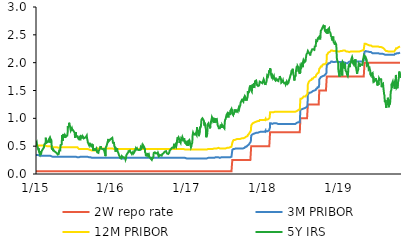
| Category | 2W repo rate | 3M PRIBOR | 12M PRIBOR | 5Y IRS |
|---|---|---|---|---|
| 2015-01-02 | 0.05 | 0.34 | 0.51 | 0.55 |
| 2015-01-05 | 0.05 | 0.34 | 0.51 | 0.57 |
| 2015-01-06 | 0.05 | 0.34 | 0.51 | 0.54 |
| 2015-01-07 | 0.05 | 0.34 | 0.51 | 0.51 |
| 2015-01-08 | 0.05 | 0.34 | 0.51 | 0.52 |
| 2015-01-09 | 0.05 | 0.34 | 0.51 | 0.49 |
| 2015-01-12 | 0.05 | 0.34 | 0.51 | 0.48 |
| 2015-01-13 | 0.05 | 0.33 | 0.51 | 0.44 |
| 2015-01-14 | 0.05 | 0.33 | 0.51 | 0.46 |
| 2015-01-15 | 0.05 | 0.33 | 0.51 | 0.45 |
| 2015-01-16 | 0.05 | 0.33 | 0.51 | 0.4 |
| 2015-01-19 | 0.05 | 0.33 | 0.51 | 0.4 |
| 2015-01-20 | 0.05 | 0.33 | 0.51 | 0.36 |
| 2015-01-21 | 0.05 | 0.33 | 0.51 | 0.38 |
| 2015-01-22 | 0.05 | 0.33 | 0.51 | 0.41 |
| 2015-01-23 | 0.05 | 0.33 | 0.51 | 0.35 |
| 2015-01-26 | 0.05 | 0.33 | 0.51 | 0.36 |
| 2015-01-27 | 0.05 | 0.33 | 0.51 | 0.38 |
| 2015-01-28 | 0.05 | 0.33 | 0.51 | 0.4 |
| 2015-01-29 | 0.05 | 0.33 | 0.51 | 0.41 |
| 2015-01-30 | 0.05 | 0.33 | 0.51 | 0.42 |
| 2015-02-02 | 0.05 | 0.33 | 0.51 | 0.41 |
| 2015-02-03 | 0.05 | 0.33 | 0.51 | 0.41 |
| 2015-02-04 | 0.05 | 0.33 | 0.51 | 0.45 |
| 2015-02-05 | 0.05 | 0.33 | 0.51 | 0.46 |
| 2015-02-06 | 0.05 | 0.33 | 0.51 | 0.46 |
| 2015-02-09 | 0.05 | 0.33 | 0.51 | 0.48 |
| 2015-02-10 | 0.05 | 0.33 | 0.51 | 0.49 |
| 2015-02-11 | 0.05 | 0.33 | 0.51 | 0.53 |
| 2015-02-12 | 0.05 | 0.33 | 0.51 | 0.54 |
| 2015-02-13 | 0.05 | 0.33 | 0.51 | 0.53 |
| 2015-02-16 | 0.05 | 0.33 | 0.51 | 0.55 |
| 2015-02-17 | 0.05 | 0.33 | 0.51 | 0.58 |
| 2015-02-18 | 0.05 | 0.33 | 0.51 | 0.65 |
| 2015-02-19 | 0.05 | 0.33 | 0.51 | 0.55 |
| 2015-02-20 | 0.05 | 0.33 | 0.5 | 0.6 |
| 2015-02-23 | 0.05 | 0.33 | 0.5 | 0.61 |
| 2015-02-24 | 0.05 | 0.33 | 0.5 | 0.61 |
| 2015-02-25 | 0.05 | 0.33 | 0.5 | 0.57 |
| 2015-02-26 | 0.05 | 0.33 | 0.5 | 0.57 |
| 2015-02-27 | 0.05 | 0.33 | 0.5 | 0.57 |
| 2015-03-02 | 0.05 | 0.33 | 0.5 | 0.58 |
| 2015-03-03 | 0.05 | 0.33 | 0.5 | 0.57 |
| 2015-03-04 | 0.05 | 0.33 | 0.5 | 0.62 |
| 2015-03-05 | 0.05 | 0.33 | 0.5 | 0.62 |
| 2015-03-06 | 0.05 | 0.33 | 0.5 | 0.62 |
| 2015-03-09 | 0.05 | 0.33 | 0.5 | 0.65 |
| 2015-03-10 | 0.05 | 0.33 | 0.5 | 0.62 |
| 2015-03-11 | 0.05 | 0.33 | 0.5 | 0.62 |
| 2015-03-12 | 0.05 | 0.33 | 0.5 | 0.56 |
| 2015-03-13 | 0.05 | 0.33 | 0.5 | 0.63 |
| 2015-03-16 | 0.05 | 0.32 | 0.49 | 0.61 |
| 2015-03-17 | 0.05 | 0.32 | 0.49 | 0.59 |
| 2015-03-18 | 0.05 | 0.31 | 0.49 | 0.5 |
| 2015-03-19 | 0.05 | 0.31 | 0.48 | 0.45 |
| 2015-03-20 | 0.05 | 0.31 | 0.48 | 0.44 |
| 2015-03-23 | 0.05 | 0.31 | 0.48 | 0.46 |
| 2015-03-24 | 0.05 | 0.31 | 0.48 | 0.44 |
| 2015-03-25 | 0.05 | 0.31 | 0.48 | 0.43 |
| 2015-03-26 | 0.05 | 0.31 | 0.48 | 0.41 |
| 2015-03-27 | 0.05 | 0.31 | 0.48 | 0.43 |
| 2015-03-30 | 0.05 | 0.31 | 0.48 | 0.41 |
| 2015-03-31 | 0.05 | 0.31 | 0.48 | 0.41 |
| 2015-04-01 | 0.05 | 0.31 | 0.48 | 0.41 |
| 2015-04-02 | 0.05 | 0.31 | 0.48 | 0.4 |
| 2015-04-03 | 0.05 | 0.31 | 0.48 | 0.4 |
| 2015-04-07 | 0.05 | 0.31 | 0.48 | 0.39 |
| 2015-04-08 | 0.05 | 0.31 | 0.48 | 0.39 |
| 2015-04-09 | 0.05 | 0.31 | 0.48 | 0.38 |
| 2015-04-10 | 0.05 | 0.31 | 0.48 | 0.38 |
| 2015-04-13 | 0.05 | 0.31 | 0.48 | 0.37 |
| 2015-04-14 | 0.05 | 0.31 | 0.47 | 0.37 |
| 2015-04-15 | 0.05 | 0.31 | 0.48 | 0.37 |
| 2015-04-16 | 0.05 | 0.31 | 0.47 | 0.35 |
| 2015-04-17 | 0.05 | 0.31 | 0.47 | 0.36 |
| 2015-04-20 | 0.05 | 0.31 | 0.47 | 0.35 |
| 2015-04-21 | 0.05 | 0.31 | 0.47 | 0.36 |
| 2015-04-22 | 0.05 | 0.31 | 0.47 | 0.38 |
| 2015-04-23 | 0.05 | 0.31 | 0.48 | 0.42 |
| 2015-04-24 | 0.05 | 0.31 | 0.47 | 0.42 |
| 2015-04-27 | 0.05 | 0.31 | 0.48 | 0.41 |
| 2015-04-28 | 0.05 | 0.31 | 0.48 | 0.42 |
| 2015-04-29 | 0.05 | 0.31 | 0.48 | 0.47 |
| 2015-04-30 | 0.05 | 0.31 | 0.48 | 0.52 |
| 2015-05-04 | 0.05 | 0.31 | 0.48 | 0.53 |
| 2015-05-05 | 0.05 | 0.31 | 0.48 | 0.53 |
| 2015-05-06 | 0.05 | 0.31 | 0.48 | 0.59 |
| 2015-05-07 | 0.05 | 0.31 | 0.48 | 0.7 |
| 2015-05-11 | 0.05 | 0.31 | 0.48 | 0.6 |
| 2015-05-12 | 0.05 | 0.31 | 0.48 | 0.69 |
| 2015-05-13 | 0.05 | 0.31 | 0.48 | 0.66 |
| 2015-05-14 | 0.05 | 0.31 | 0.48 | 0.72 |
| 2015-05-15 | 0.05 | 0.31 | 0.48 | 0.7 |
| 2015-05-18 | 0.05 | 0.31 | 0.48 | 0.7 |
| 2015-05-19 | 0.05 | 0.31 | 0.48 | 0.65 |
| 2015-05-20 | 0.05 | 0.31 | 0.48 | 0.68 |
| 2015-05-21 | 0.05 | 0.31 | 0.48 | 0.7 |
| 2015-05-22 | 0.05 | 0.31 | 0.48 | 0.7 |
| 2015-05-25 | 0.05 | 0.31 | 0.48 | 0.7 |
| 2015-05-26 | 0.05 | 0.31 | 0.48 | 0.67 |
| 2015-05-27 | 0.05 | 0.31 | 0.48 | 0.67 |
| 2015-05-28 | 0.05 | 0.31 | 0.48 | 0.66 |
| 2015-05-29 | 0.05 | 0.31 | 0.48 | 0.68 |
| 2015-06-01 | 0.05 | 0.31 | 0.48 | 0.69 |
| 2015-06-02 | 0.05 | 0.31 | 0.48 | 0.72 |
| 2015-06-03 | 0.05 | 0.31 | 0.48 | 0.75 |
| 2015-06-04 | 0.05 | 0.31 | 0.48 | 0.86 |
| 2015-06-05 | 0.05 | 0.31 | 0.48 | 0.84 |
| 2015-06-08 | 0.05 | 0.31 | 0.48 | 0.84 |
| 2015-06-09 | 0.05 | 0.31 | 0.48 | 0.86 |
| 2015-06-10 | 0.05 | 0.31 | 0.48 | 0.92 |
| 2015-06-11 | 0.05 | 0.31 | 0.48 | 0.92 |
| 2015-06-12 | 0.05 | 0.31 | 0.48 | 0.89 |
| 2015-06-15 | 0.05 | 0.31 | 0.48 | 0.85 |
| 2015-06-16 | 0.05 | 0.31 | 0.48 | 0.82 |
| 2015-06-17 | 0.05 | 0.31 | 0.48 | 0.82 |
| 2015-06-18 | 0.05 | 0.31 | 0.48 | 0.78 |
| 2015-06-19 | 0.05 | 0.31 | 0.48 | 0.77 |
| 2015-06-22 | 0.05 | 0.31 | 0.48 | 0.79 |
| 2015-06-23 | 0.05 | 0.31 | 0.48 | 0.82 |
| 2015-06-24 | 0.05 | 0.31 | 0.48 | 0.8 |
| 2015-06-25 | 0.05 | 0.31 | 0.48 | 0.78 |
| 2015-06-26 | 0.05 | 0.31 | 0.48 | 0.8 |
| 2015-06-29 | 0.05 | 0.31 | 0.48 | 0.8 |
| 2015-06-30 | 0.05 | 0.31 | 0.48 | 0.78 |
| 2015-07-01 | 0.05 | 0.31 | 0.48 | 0.79 |
| 2015-07-02 | 0.05 | 0.31 | 0.48 | 0.79 |
| 2015-07-03 | 0.05 | 0.31 | 0.48 | 0.78 |
| 2015-07-07 | 0.05 | 0.31 | 0.48 | 0.74 |
| 2015-07-08 | 0.05 | 0.31 | 0.47 | 0.68 |
| 2015-07-09 | 0.05 | 0.31 | 0.47 | 0.65 |
| 2015-07-10 | 0.05 | 0.31 | 0.47 | 0.7 |
| 2015-07-13 | 0.05 | 0.31 | 0.48 | 0.75 |
| 2015-07-14 | 0.05 | 0.31 | 0.48 | 0.68 |
| 2015-07-15 | 0.05 | 0.3 | 0.48 | 0.69 |
| 2015-07-16 | 0.05 | 0.3 | 0.48 | 0.67 |
| 2015-07-17 | 0.05 | 0.3 | 0.48 | 0.69 |
| 2015-07-20 | 0.05 | 0.3 | 0.48 | 0.68 |
| 2015-07-21 | 0.05 | 0.3 | 0.48 | 0.66 |
| 2015-07-22 | 0.05 | 0.31 | 0.48 | 0.67 |
| 2015-07-23 | 0.05 | 0.31 | 0.48 | 0.67 |
| 2015-07-24 | 0.05 | 0.3 | 0.48 | 0.64 |
| 2015-07-27 | 0.05 | 0.3 | 0.45 | 0.63 |
| 2015-07-28 | 0.05 | 0.3 | 0.45 | 0.63 |
| 2015-07-29 | 0.05 | 0.3 | 0.45 | 0.66 |
| 2015-07-30 | 0.05 | 0.3 | 0.45 | 0.62 |
| 2015-07-31 | 0.05 | 0.31 | 0.45 | 0.62 |
| 2015-08-03 | 0.05 | 0.31 | 0.45 | 0.62 |
| 2015-08-04 | 0.05 | 0.31 | 0.45 | 0.62 |
| 2015-08-05 | 0.05 | 0.31 | 0.45 | 0.64 |
| 2015-08-06 | 0.05 | 0.31 | 0.45 | 0.68 |
| 2015-08-07 | 0.05 | 0.31 | 0.45 | 0.68 |
| 2015-08-10 | 0.05 | 0.31 | 0.45 | 0.68 |
| 2015-08-11 | 0.05 | 0.31 | 0.45 | 0.67 |
| 2015-08-12 | 0.05 | 0.31 | 0.45 | 0.64 |
| 2015-08-13 | 0.05 | 0.31 | 0.45 | 0.65 |
| 2015-08-14 | 0.05 | 0.31 | 0.45 | 0.68 |
| 2015-08-17 | 0.05 | 0.31 | 0.45 | 0.67 |
| 2015-08-18 | 0.05 | 0.31 | 0.45 | 0.66 |
| 2015-08-19 | 0.05 | 0.31 | 0.45 | 0.65 |
| 2015-08-20 | 0.05 | 0.31 | 0.45 | 0.64 |
| 2015-08-21 | 0.05 | 0.31 | 0.45 | 0.64 |
| 2015-08-24 | 0.05 | 0.31 | 0.45 | 0.63 |
| 2015-08-25 | 0.05 | 0.31 | 0.45 | 0.65 |
| 2015-08-26 | 0.05 | 0.31 | 0.45 | 0.65 |
| 2015-08-27 | 0.05 | 0.31 | 0.45 | 0.66 |
| 2015-08-28 | 0.05 | 0.31 | 0.45 | 0.66 |
| 2015-08-31 | 0.05 | 0.31 | 0.45 | 0.67 |
| 2015-09-01 | 0.05 | 0.31 | 0.45 | 0.68 |
| 2015-09-02 | 0.05 | 0.31 | 0.45 | 0.68 |
| 2015-09-03 | 0.05 | 0.31 | 0.45 | 0.69 |
| 2015-09-04 | 0.05 | 0.31 | 0.45 | 0.65 |
| 2015-09-07 | 0.05 | 0.31 | 0.45 | 0.6 |
| 2015-09-08 | 0.05 | 0.3 | 0.44 | 0.57 |
| 2015-09-09 | 0.05 | 0.3 | 0.44 | 0.57 |
| 2015-09-10 | 0.05 | 0.3 | 0.44 | 0.57 |
| 2015-09-11 | 0.05 | 0.3 | 0.44 | 0.56 |
| 2015-09-14 | 0.05 | 0.3 | 0.44 | 0.52 |
| 2015-09-15 | 0.05 | 0.3 | 0.44 | 0.54 |
| 2015-09-16 | 0.05 | 0.31 | 0.44 | 0.56 |
| 2015-09-17 | 0.05 | 0.31 | 0.44 | 0.57 |
| 2015-09-18 | 0.05 | 0.31 | 0.44 | 0.53 |
| 2015-09-21 | 0.05 | 0.3 | 0.43 | 0.53 |
| 2015-09-22 | 0.05 | 0.3 | 0.43 | 0.51 |
| 2015-09-23 | 0.05 | 0.3 | 0.43 | 0.53 |
| 2015-09-24 | 0.05 | 0.3 | 0.43 | 0.53 |
| 2015-09-25 | 0.05 | 0.29 | 0.42 | 0.53 |
| 2015-09-29 | 0.05 | 0.29 | 0.42 | 0.53 |
| 2015-09-30 | 0.05 | 0.29 | 0.42 | 0.48 |
| 2015-10-01 | 0.05 | 0.29 | 0.42 | 0.53 |
| 2015-10-02 | 0.05 | 0.29 | 0.42 | 0.53 |
| 2015-10-05 | 0.05 | 0.29 | 0.42 | 0.42 |
| 2015-10-06 | 0.05 | 0.29 | 0.42 | 0.46 |
| 2015-10-07 | 0.05 | 0.29 | 0.42 | 0.46 |
| 2015-10-08 | 0.05 | 0.29 | 0.42 | 0.44 |
| 2015-10-09 | 0.05 | 0.29 | 0.42 | 0.44 |
| 2015-10-12 | 0.05 | 0.29 | 0.42 | 0.45 |
| 2015-10-13 | 0.05 | 0.29 | 0.42 | 0.43 |
| 2015-10-14 | 0.05 | 0.29 | 0.42 | 0.43 |
| 2015-10-15 | 0.05 | 0.29 | 0.42 | 0.43 |
| 2015-10-16 | 0.05 | 0.29 | 0.42 | 0.44 |
| 2015-10-19 | 0.05 | 0.29 | 0.42 | 0.46 |
| 2015-10-20 | 0.05 | 0.29 | 0.42 | 0.44 |
| 2015-10-21 | 0.05 | 0.29 | 0.42 | 0.45 |
| 2015-10-22 | 0.05 | 0.29 | 0.42 | 0.42 |
| 2015-10-23 | 0.05 | 0.29 | 0.42 | 0.39 |
| 2015-10-26 | 0.05 | 0.29 | 0.46 | 0.4 |
| 2015-10-27 | 0.05 | 0.29 | 0.45 | 0.38 |
| 2015-10-29 | 0.05 | 0.29 | 0.45 | 0.38 |
| 2015-10-30 | 0.05 | 0.29 | 0.45 | 0.41 |
| 2015-11-02 | 0.05 | 0.29 | 0.45 | 0.43 |
| 2015-11-03 | 0.05 | 0.29 | 0.46 | 0.44 |
| 2015-11-04 | 0.05 | 0.29 | 0.46 | 0.44 |
| 2015-11-05 | 0.05 | 0.29 | 0.46 | 0.44 |
| 2015-11-06 | 0.05 | 0.29 | 0.45 | 0.44 |
| 2015-11-09 | 0.05 | 0.29 | 0.46 | 0.5 |
| 2015-11-10 | 0.05 | 0.29 | 0.46 | 0.46 |
| 2015-11-11 | 0.05 | 0.29 | 0.46 | 0.46 |
| 2015-11-12 | 0.05 | 0.29 | 0.46 | 0.45 |
| 2015-11-13 | 0.05 | 0.29 | 0.46 | 0.46 |
| 2015-11-16 | 0.05 | 0.29 | 0.46 | 0.45 |
| 2015-11-18 | 0.05 | 0.29 | 0.46 | 0.45 |
| 2015-11-19 | 0.05 | 0.29 | 0.46 | 0.44 |
| 2015-11-20 | 0.05 | 0.29 | 0.46 | 0.44 |
| 2015-11-23 | 0.05 | 0.29 | 0.46 | 0.44 |
| 2015-11-24 | 0.05 | 0.29 | 0.46 | 0.44 |
| 2015-11-25 | 0.05 | 0.29 | 0.46 | 0.46 |
| 2015-11-26 | 0.05 | 0.29 | 0.46 | 0.42 |
| 2015-11-27 | 0.05 | 0.29 | 0.45 | 0.42 |
| 2015-11-30 | 0.05 | 0.29 | 0.45 | 0.36 |
| 2015-12-01 | 0.05 | 0.28 | 0.45 | 0.37 |
| 2015-12-02 | 0.05 | 0.28 | 0.45 | 0.32 |
| 2015-12-03 | 0.05 | 0.28 | 0.45 | 0.34 |
| 2015-12-04 | 0.05 | 0.29 | 0.46 | 0.48 |
| 2015-12-07 | 0.05 | 0.29 | 0.46 | 0.5 |
| 2015-12-08 | 0.05 | 0.29 | 0.46 | 0.49 |
| 2015-12-09 | 0.05 | 0.29 | 0.46 | 0.51 |
| 2015-12-10 | 0.05 | 0.29 | 0.46 | 0.54 |
| 2015-12-11 | 0.05 | 0.29 | 0.46 | 0.53 |
| 2015-12-14 | 0.05 | 0.29 | 0.46 | 0.55 |
| 2015-12-15 | 0.05 | 0.29 | 0.46 | 0.61 |
| 2015-12-16 | 0.05 | 0.29 | 0.46 | 0.63 |
| 2015-12-17 | 0.05 | 0.29 | 0.46 | 0.62 |
| 2015-12-18 | 0.05 | 0.29 | 0.46 | 0.59 |
| 2015-12-21 | 0.05 | 0.29 | 0.46 | 0.59 |
| 2015-12-22 | 0.05 | 0.29 | 0.46 | 0.59 |
| 2015-12-23 | 0.05 | 0.29 | 0.46 | 0.61 |
| 2015-12-28 | 0.05 | 0.29 | 0.46 | 0.63 |
| 2015-12-29 | 0.05 | 0.29 | 0.46 | 0.63 |
| 2015-12-30 | 0.05 | 0.29 | 0.46 | 0.64 |
| 2015-12-31 | 0.05 | 0.29 | 0.46 | 0.64 |
| 2016-01-04 | 0.05 | 0.29 | 0.46 | 0.65 |
| 2016-01-05 | 0.05 | 0.29 | 0.46 | 0.63 |
| 2016-01-06 | 0.05 | 0.29 | 0.46 | 0.62 |
| 2016-01-07 | 0.05 | 0.29 | 0.46 | 0.56 |
| 2016-01-08 | 0.05 | 0.29 | 0.46 | 0.57 |
| 2016-01-11 | 0.05 | 0.29 | 0.45 | 0.56 |
| 2016-01-12 | 0.05 | 0.29 | 0.45 | 0.56 |
| 2016-01-13 | 0.05 | 0.29 | 0.45 | 0.56 |
| 2016-01-14 | 0.05 | 0.29 | 0.45 | 0.5 |
| 2016-01-15 | 0.05 | 0.29 | 0.45 | 0.49 |
| 2016-01-18 | 0.05 | 0.29 | 0.45 | 0.46 |
| 2016-01-19 | 0.05 | 0.29 | 0.45 | 0.46 |
| 2016-01-20 | 0.05 | 0.29 | 0.45 | 0.4 |
| 2016-01-21 | 0.05 | 0.29 | 0.45 | 0.43 |
| 2016-01-22 | 0.05 | 0.29 | 0.45 | 0.46 |
| 2016-01-25 | 0.05 | 0.29 | 0.45 | 0.45 |
| 2016-01-26 | 0.05 | 0.29 | 0.45 | 0.44 |
| 2016-01-27 | 0.05 | 0.29 | 0.45 | 0.46 |
| 2016-01-28 | 0.05 | 0.29 | 0.45 | 0.44 |
| 2016-01-29 | 0.05 | 0.29 | 0.45 | 0.41 |
| 2016-02-01 | 0.05 | 0.29 | 0.45 | 0.4 |
| 2016-02-02 | 0.05 | 0.29 | 0.45 | 0.38 |
| 2016-02-03 | 0.05 | 0.29 | 0.45 | 0.37 |
| 2016-02-04 | 0.05 | 0.29 | 0.45 | 0.37 |
| 2016-02-05 | 0.05 | 0.29 | 0.45 | 0.34 |
| 2016-02-08 | 0.05 | 0.29 | 0.45 | 0.32 |
| 2016-02-09 | 0.05 | 0.28 | 0.45 | 0.31 |
| 2016-02-10 | 0.05 | 0.28 | 0.45 | 0.31 |
| 2016-02-11 | 0.05 | 0.28 | 0.45 | 0.29 |
| 2016-02-12 | 0.05 | 0.28 | 0.45 | 0.28 |
| 2016-02-15 | 0.05 | 0.28 | 0.45 | 0.28 |
| 2016-02-16 | 0.05 | 0.28 | 0.45 | 0.28 |
| 2016-02-17 | 0.05 | 0.28 | 0.45 | 0.28 |
| 2016-02-18 | 0.05 | 0.28 | 0.45 | 0.3 |
| 2016-02-19 | 0.05 | 0.28 | 0.45 | 0.32 |
| 2016-02-22 | 0.05 | 0.28 | 0.45 | 0.32 |
| 2016-02-23 | 0.05 | 0.28 | 0.45 | 0.32 |
| 2016-02-24 | 0.05 | 0.28 | 0.45 | 0.3 |
| 2016-02-25 | 0.05 | 0.28 | 0.45 | 0.3 |
| 2016-02-26 | 0.05 | 0.28 | 0.45 | 0.31 |
| 2016-02-29 | 0.05 | 0.28 | 0.45 | 0.3 |
| 2016-03-01 | 0.05 | 0.28 | 0.45 | 0.29 |
| 2016-03-02 | 0.05 | 0.28 | 0.45 | 0.31 |
| 2016-03-03 | 0.05 | 0.28 | 0.45 | 0.3 |
| 2016-03-04 | 0.05 | 0.28 | 0.45 | 0.29 |
| 2016-03-07 | 0.05 | 0.28 | 0.45 | 0.28 |
| 2016-03-08 | 0.05 | 0.28 | 0.45 | 0.26 |
| 2016-03-09 | 0.05 | 0.28 | 0.45 | 0.26 |
| 2016-03-10 | 0.05 | 0.28 | 0.45 | 0.28 |
| 2016-03-11 | 0.05 | 0.29 | 0.45 | 0.33 |
| 2016-03-14 | 0.05 | 0.29 | 0.45 | 0.34 |
| 2016-03-15 | 0.05 | 0.29 | 0.45 | 0.36 |
| 2016-03-16 | 0.05 | 0.29 | 0.45 | 0.37 |
| 2016-03-17 | 0.05 | 0.29 | 0.45 | 0.37 |
| 2016-03-18 | 0.05 | 0.29 | 0.45 | 0.37 |
| 2016-03-21 | 0.05 | 0.29 | 0.45 | 0.39 |
| 2016-03-22 | 0.05 | 0.29 | 0.45 | 0.41 |
| 2016-03-23 | 0.05 | 0.29 | 0.45 | 0.41 |
| 2016-03-24 | 0.05 | 0.29 | 0.45 | 0.4 |
| 2016-03-29 | 0.05 | 0.29 | 0.45 | 0.42 |
| 2016-03-30 | 0.05 | 0.29 | 0.45 | 0.4 |
| 2016-03-31 | 0.05 | 0.29 | 0.45 | 0.4 |
| 2016-04-01 | 0.05 | 0.29 | 0.45 | 0.4 |
| 2016-04-04 | 0.05 | 0.29 | 0.45 | 0.38 |
| 2016-04-05 | 0.05 | 0.29 | 0.45 | 0.37 |
| 2016-04-06 | 0.05 | 0.29 | 0.45 | 0.38 |
| 2016-04-07 | 0.05 | 0.29 | 0.45 | 0.36 |
| 2016-04-08 | 0.05 | 0.29 | 0.45 | 0.36 |
| 2016-04-11 | 0.05 | 0.29 | 0.45 | 0.35 |
| 2016-04-12 | 0.05 | 0.29 | 0.45 | 0.39 |
| 2016-04-13 | 0.05 | 0.29 | 0.45 | 0.37 |
| 2016-04-14 | 0.05 | 0.29 | 0.45 | 0.39 |
| 2016-04-15 | 0.05 | 0.29 | 0.45 | 0.37 |
| 2016-04-18 | 0.05 | 0.29 | 0.45 | 0.37 |
| 2016-04-19 | 0.05 | 0.29 | 0.45 | 0.39 |
| 2016-04-20 | 0.05 | 0.29 | 0.45 | 0.38 |
| 2016-04-21 | 0.05 | 0.29 | 0.45 | 0.41 |
| 2016-04-22 | 0.05 | 0.29 | 0.45 | 0.41 |
| 2016-04-25 | 0.05 | 0.29 | 0.45 | 0.42 |
| 2016-04-26 | 0.05 | 0.29 | 0.45 | 0.46 |
| 2016-04-27 | 0.05 | 0.29 | 0.45 | 0.46 |
| 2016-04-28 | 0.05 | 0.29 | 0.45 | 0.44 |
| 2016-04-29 | 0.05 | 0.29 | 0.45 | 0.45 |
| 2016-05-02 | 0.05 | 0.29 | 0.45 | 0.46 |
| 2016-05-03 | 0.05 | 0.29 | 0.45 | 0.46 |
| 2016-05-04 | 0.05 | 0.29 | 0.45 | 0.44 |
| 2016-05-05 | 0.05 | 0.29 | 0.45 | 0.45 |
| 2016-05-06 | 0.05 | 0.29 | 0.45 | 0.44 |
| 2016-05-09 | 0.05 | 0.29 | 0.45 | 0.43 |
| 2016-05-10 | 0.05 | 0.29 | 0.45 | 0.44 |
| 2016-05-11 | 0.05 | 0.29 | 0.45 | 0.43 |
| 2016-05-12 | 0.05 | 0.29 | 0.45 | 0.42 |
| 2016-05-13 | 0.05 | 0.29 | 0.45 | 0.43 |
| 2016-05-16 | 0.05 | 0.29 | 0.45 | 0.43 |
| 2016-05-17 | 0.05 | 0.29 | 0.45 | 0.44 |
| 2016-05-18 | 0.05 | 0.29 | 0.45 | 0.44 |
| 2016-05-19 | 0.05 | 0.29 | 0.45 | 0.46 |
| 2016-05-20 | 0.05 | 0.29 | 0.45 | 0.48 |
| 2016-05-23 | 0.05 | 0.29 | 0.45 | 0.46 |
| 2016-05-24 | 0.05 | 0.29 | 0.45 | 0.46 |
| 2016-05-25 | 0.05 | 0.29 | 0.45 | 0.48 |
| 2016-05-26 | 0.05 | 0.29 | 0.45 | 0.48 |
| 2016-05-27 | 0.05 | 0.29 | 0.45 | 0.51 |
| 2016-05-30 | 0.05 | 0.29 | 0.45 | 0.49 |
| 2016-05-31 | 0.05 | 0.29 | 0.45 | 0.52 |
| 2016-06-01 | 0.05 | 0.29 | 0.45 | 0.51 |
| 2016-06-02 | 0.05 | 0.29 | 0.45 | 0.51 |
| 2016-06-03 | 0.05 | 0.29 | 0.45 | 0.51 |
| 2016-06-06 | 0.05 | 0.29 | 0.45 | 0.48 |
| 2016-06-07 | 0.05 | 0.29 | 0.45 | 0.49 |
| 2016-06-08 | 0.05 | 0.29 | 0.45 | 0.47 |
| 2016-06-09 | 0.05 | 0.29 | 0.45 | 0.45 |
| 2016-06-10 | 0.05 | 0.29 | 0.45 | 0.39 |
| 2016-06-13 | 0.05 | 0.29 | 0.45 | 0.37 |
| 2016-06-14 | 0.05 | 0.29 | 0.45 | 0.32 |
| 2016-06-15 | 0.05 | 0.29 | 0.45 | 0.32 |
| 2016-06-16 | 0.05 | 0.29 | 0.45 | 0.32 |
| 2016-06-17 | 0.05 | 0.29 | 0.45 | 0.35 |
| 2016-06-20 | 0.05 | 0.29 | 0.45 | 0.35 |
| 2016-06-21 | 0.05 | 0.29 | 0.45 | 0.36 |
| 2016-06-22 | 0.05 | 0.29 | 0.45 | 0.36 |
| 2016-06-23 | 0.05 | 0.29 | 0.45 | 0.36 |
| 2016-06-24 | 0.05 | 0.29 | 0.45 | 0.33 |
| 2016-06-27 | 0.05 | 0.29 | 0.45 | 0.32 |
| 2016-06-28 | 0.05 | 0.29 | 0.45 | 0.35 |
| 2016-06-29 | 0.05 | 0.29 | 0.45 | 0.33 |
| 2016-06-30 | 0.05 | 0.29 | 0.45 | 0.31 |
| 2016-07-01 | 0.05 | 0.29 | 0.45 | 0.31 |
| 2016-07-04 | 0.05 | 0.29 | 0.45 | 0.29 |
| 2016-07-07 | 0.05 | 0.29 | 0.45 | 0.28 |
| 2016-07-08 | 0.05 | 0.29 | 0.45 | 0.28 |
| 2016-07-11 | 0.05 | 0.29 | 0.45 | 0.26 |
| 2016-07-12 | 0.05 | 0.29 | 0.45 | 0.3 |
| 2016-07-13 | 0.05 | 0.29 | 0.45 | 0.29 |
| 2016-07-14 | 0.05 | 0.29 | 0.45 | 0.27 |
| 2016-07-15 | 0.05 | 0.29 | 0.45 | 0.28 |
| 2016-07-18 | 0.05 | 0.29 | 0.45 | 0.29 |
| 2016-07-19 | 0.05 | 0.29 | 0.45 | 0.28 |
| 2016-07-20 | 0.05 | 0.29 | 0.45 | 0.32 |
| 2016-07-21 | 0.05 | 0.29 | 0.45 | 0.36 |
| 2016-07-22 | 0.05 | 0.29 | 0.45 | 0.38 |
| 2016-07-25 | 0.05 | 0.29 | 0.45 | 0.38 |
| 2016-07-26 | 0.05 | 0.29 | 0.45 | 0.38 |
| 2016-07-27 | 0.05 | 0.29 | 0.45 | 0.39 |
| 2016-07-28 | 0.05 | 0.29 | 0.45 | 0.38 |
| 2016-07-29 | 0.05 | 0.29 | 0.45 | 0.38 |
| 2016-08-01 | 0.05 | 0.29 | 0.45 | 0.37 |
| 2016-08-02 | 0.05 | 0.29 | 0.45 | 0.37 |
| 2016-08-03 | 0.05 | 0.29 | 0.45 | 0.37 |
| 2016-08-04 | 0.05 | 0.29 | 0.45 | 0.38 |
| 2016-08-05 | 0.05 | 0.29 | 0.45 | 0.38 |
| 2016-08-08 | 0.05 | 0.29 | 0.45 | 0.38 |
| 2016-08-09 | 0.05 | 0.29 | 0.45 | 0.37 |
| 2016-08-10 | 0.05 | 0.29 | 0.45 | 0.37 |
| 2016-08-11 | 0.05 | 0.29 | 0.45 | 0.35 |
| 2016-08-12 | 0.05 | 0.29 | 0.45 | 0.37 |
| 2016-08-15 | 0.05 | 0.29 | 0.45 | 0.34 |
| 2016-08-16 | 0.05 | 0.29 | 0.45 | 0.32 |
| 2016-08-17 | 0.05 | 0.29 | 0.45 | 0.33 |
| 2016-08-18 | 0.05 | 0.29 | 0.45 | 0.33 |
| 2016-08-19 | 0.05 | 0.29 | 0.45 | 0.33 |
| 2016-08-22 | 0.05 | 0.29 | 0.45 | 0.34 |
| 2016-08-23 | 0.05 | 0.29 | 0.45 | 0.33 |
| 2016-08-24 | 0.05 | 0.29 | 0.45 | 0.33 |
| 2016-08-25 | 0.05 | 0.29 | 0.45 | 0.33 |
| 2016-08-26 | 0.05 | 0.29 | 0.45 | 0.33 |
| 2016-08-29 | 0.05 | 0.29 | 0.45 | 0.33 |
| 2016-08-30 | 0.05 | 0.29 | 0.45 | 0.33 |
| 2016-08-31 | 0.05 | 0.29 | 0.45 | 0.34 |
| 2016-09-01 | 0.05 | 0.29 | 0.45 | 0.36 |
| 2016-09-02 | 0.05 | 0.29 | 0.45 | 0.36 |
| 2016-09-05 | 0.05 | 0.29 | 0.45 | 0.37 |
| 2016-09-06 | 0.05 | 0.29 | 0.45 | 0.37 |
| 2016-09-07 | 0.05 | 0.29 | 0.45 | 0.36 |
| 2016-09-08 | 0.05 | 0.29 | 0.45 | 0.36 |
| 2016-09-09 | 0.05 | 0.29 | 0.45 | 0.38 |
| 2016-09-12 | 0.05 | 0.29 | 0.45 | 0.4 |
| 2016-09-13 | 0.05 | 0.29 | 0.45 | 0.4 |
| 2016-09-14 | 0.05 | 0.29 | 0.45 | 0.4 |
| 2016-09-15 | 0.05 | 0.29 | 0.45 | 0.41 |
| 2016-09-16 | 0.05 | 0.29 | 0.45 | 0.41 |
| 2016-09-19 | 0.05 | 0.29 | 0.45 | 0.41 |
| 2016-09-20 | 0.05 | 0.29 | 0.45 | 0.41 |
| 2016-09-21 | 0.05 | 0.29 | 0.45 | 0.39 |
| 2016-09-22 | 0.05 | 0.29 | 0.45 | 0.38 |
| 2016-09-23 | 0.05 | 0.29 | 0.45 | 0.37 |
| 2016-09-26 | 0.05 | 0.29 | 0.45 | 0.36 |
| 2016-09-27 | 0.05 | 0.29 | 0.45 | 0.36 |
| 2016-09-29 | 0.05 | 0.29 | 0.45 | 0.36 |
| 2016-09-30 | 0.05 | 0.29 | 0.45 | 0.36 |
| 2016-10-03 | 0.05 | 0.29 | 0.45 | 0.37 |
| 2016-10-04 | 0.05 | 0.29 | 0.45 | 0.38 |
| 2016-10-05 | 0.05 | 0.29 | 0.45 | 0.39 |
| 2016-10-06 | 0.05 | 0.29 | 0.45 | 0.42 |
| 2016-10-07 | 0.05 | 0.29 | 0.45 | 0.42 |
| 2016-10-10 | 0.05 | 0.29 | 0.45 | 0.43 |
| 2016-10-11 | 0.05 | 0.29 | 0.45 | 0.44 |
| 2016-10-12 | 0.05 | 0.29 | 0.45 | 0.44 |
| 2016-10-13 | 0.05 | 0.29 | 0.45 | 0.45 |
| 2016-10-14 | 0.05 | 0.29 | 0.45 | 0.45 |
| 2016-10-17 | 0.05 | 0.29 | 0.45 | 0.47 |
| 2016-10-18 | 0.05 | 0.29 | 0.45 | 0.47 |
| 2016-10-19 | 0.05 | 0.29 | 0.45 | 0.47 |
| 2016-10-20 | 0.05 | 0.29 | 0.45 | 0.48 |
| 2016-10-21 | 0.05 | 0.29 | 0.45 | 0.48 |
| 2016-10-24 | 0.05 | 0.29 | 0.45 | 0.48 |
| 2016-10-25 | 0.05 | 0.29 | 0.45 | 0.46 |
| 2016-10-26 | 0.05 | 0.29 | 0.45 | 0.48 |
| 2016-10-27 | 0.05 | 0.29 | 0.45 | 0.53 |
| 2016-10-31 | 0.05 | 0.29 | 0.45 | 0.54 |
| 2016-11-01 | 0.05 | 0.29 | 0.45 | 0.53 |
| 2016-11-02 | 0.05 | 0.29 | 0.45 | 0.51 |
| 2016-11-03 | 0.05 | 0.29 | 0.45 | 0.52 |
| 2016-11-04 | 0.05 | 0.29 | 0.45 | 0.53 |
| 2016-11-07 | 0.05 | 0.29 | 0.45 | 0.5 |
| 2016-11-08 | 0.05 | 0.29 | 0.45 | 0.49 |
| 2016-11-09 | 0.05 | 0.29 | 0.45 | 0.51 |
| 2016-11-10 | 0.05 | 0.29 | 0.45 | 0.55 |
| 2016-11-11 | 0.05 | 0.29 | 0.45 | 0.61 |
| 2016-11-14 | 0.05 | 0.29 | 0.45 | 0.66 |
| 2016-11-15 | 0.05 | 0.29 | 0.45 | 0.64 |
| 2016-11-16 | 0.05 | 0.29 | 0.45 | 0.65 |
| 2016-11-18 | 0.05 | 0.29 | 0.45 | 0.66 |
| 2016-11-21 | 0.05 | 0.29 | 0.45 | 0.63 |
| 2016-11-22 | 0.05 | 0.29 | 0.45 | 0.6 |
| 2016-11-23 | 0.05 | 0.29 | 0.45 | 0.56 |
| 2016-11-24 | 0.05 | 0.29 | 0.45 | 0.59 |
| 2016-11-25 | 0.05 | 0.29 | 0.45 | 0.59 |
| 2016-11-28 | 0.05 | 0.29 | 0.45 | 0.56 |
| 2016-11-29 | 0.05 | 0.29 | 0.45 | 0.56 |
| 2016-11-30 | 0.05 | 0.29 | 0.45 | 0.57 |
| 2016-12-01 | 0.05 | 0.29 | 0.45 | 0.64 |
| 2016-12-02 | 0.05 | 0.29 | 0.45 | 0.63 |
| 2016-12-05 | 0.05 | 0.29 | 0.45 | 0.62 |
| 2016-12-06 | 0.05 | 0.29 | 0.45 | 0.64 |
| 2016-12-07 | 0.05 | 0.29 | 0.45 | 0.66 |
| 2016-12-08 | 0.05 | 0.29 | 0.45 | 0.66 |
| 2016-12-09 | 0.05 | 0.29 | 0.45 | 0.64 |
| 2016-12-12 | 0.05 | 0.29 | 0.45 | 0.65 |
| 2016-12-13 | 0.05 | 0.29 | 0.45 | 0.63 |
| 2016-12-14 | 0.05 | 0.29 | 0.45 | 0.6 |
| 2016-12-15 | 0.05 | 0.29 | 0.45 | 0.64 |
| 2016-12-16 | 0.05 | 0.29 | 0.45 | 0.62 |
| 2016-12-19 | 0.05 | 0.29 | 0.44 | 0.59 |
| 2016-12-20 | 0.05 | 0.29 | 0.44 | 0.57 |
| 2016-12-21 | 0.05 | 0.29 | 0.44 | 0.56 |
| 2016-12-22 | 0.05 | 0.28 | 0.44 | 0.57 |
| 2016-12-23 | 0.05 | 0.28 | 0.44 | 0.55 |
| 2016-12-27 | 0.05 | 0.28 | 0.44 | 0.57 |
| 2016-12-28 | 0.05 | 0.27 | 0.43 | 0.54 |
| 2016-12-29 | 0.05 | 0.28 | 0.44 | 0.52 |
| 2016-12-30 | 0.05 | 0.28 | 0.44 | 0.52 |
| 2017-01-02 | 0.05 | 0.28 | 0.44 | 0.52 |
| 2017-01-03 | 0.05 | 0.28 | 0.44 | 0.52 |
| 2017-01-04 | 0.05 | 0.28 | 0.44 | 0.57 |
| 2017-01-05 | 0.05 | 0.28 | 0.44 | 0.59 |
| 2017-01-06 | 0.05 | 0.28 | 0.44 | 0.58 |
| 2017-01-09 | 0.05 | 0.28 | 0.44 | 0.61 |
| 2017-01-10 | 0.05 | 0.28 | 0.44 | 0.6 |
| 2017-01-11 | 0.05 | 0.28 | 0.44 | 0.59 |
| 2017-01-12 | 0.05 | 0.28 | 0.44 | 0.56 |
| 2017-01-13 | 0.05 | 0.28 | 0.44 | 0.52 |
| 2017-01-16 | 0.05 | 0.28 | 0.44 | 0.5 |
| 2017-01-17 | 0.05 | 0.28 | 0.44 | 0.48 |
| 2017-01-18 | 0.05 | 0.28 | 0.44 | 0.48 |
| 2017-01-19 | 0.05 | 0.28 | 0.44 | 0.5 |
| 2017-01-20 | 0.05 | 0.28 | 0.44 | 0.53 |
| 2017-01-23 | 0.05 | 0.28 | 0.44 | 0.56 |
| 2017-01-24 | 0.05 | 0.28 | 0.44 | 0.62 |
| 2017-01-25 | 0.05 | 0.28 | 0.44 | 0.7 |
| 2017-01-26 | 0.05 | 0.28 | 0.44 | 0.7 |
| 2017-01-27 | 0.05 | 0.28 | 0.44 | 0.74 |
| 2017-01-30 | 0.05 | 0.28 | 0.44 | 0.71 |
| 2017-01-31 | 0.05 | 0.28 | 0.44 | 0.71 |
| 2017-02-01 | 0.05 | 0.28 | 0.44 | 0.7 |
| 2017-02-02 | 0.05 | 0.28 | 0.44 | 0.72 |
| 2017-02-03 | 0.05 | 0.28 | 0.44 | 0.71 |
| 2017-02-06 | 0.05 | 0.28 | 0.44 | 0.71 |
| 2017-02-07 | 0.05 | 0.28 | 0.44 | 0.74 |
| 2017-02-08 | 0.05 | 0.28 | 0.44 | 0.75 |
| 2017-02-09 | 0.05 | 0.28 | 0.44 | 0.7 |
| 2017-02-10 | 0.05 | 0.28 | 0.44 | 0.72 |
| 2017-02-13 | 0.05 | 0.28 | 0.44 | 0.7 |
| 2017-02-14 | 0.05 | 0.28 | 0.44 | 0.77 |
| 2017-02-15 | 0.05 | 0.28 | 0.44 | 0.84 |
| 2017-02-16 | 0.05 | 0.28 | 0.44 | 0.83 |
| 2017-02-17 | 0.05 | 0.28 | 0.44 | 0.76 |
| 2017-02-20 | 0.05 | 0.28 | 0.44 | 0.79 |
| 2017-02-21 | 0.05 | 0.28 | 0.44 | 0.8 |
| 2017-02-22 | 0.05 | 0.28 | 0.44 | 0.78 |
| 2017-02-23 | 0.05 | 0.28 | 0.44 | 0.7 |
| 2017-02-24 | 0.05 | 0.28 | 0.44 | 0.68 |
| 2017-02-27 | 0.05 | 0.28 | 0.44 | 0.68 |
| 2017-02-28 | 0.05 | 0.28 | 0.44 | 0.77 |
| 2017-03-01 | 0.05 | 0.28 | 0.44 | 0.77 |
| 2017-03-02 | 0.05 | 0.28 | 0.44 | 0.85 |
| 2017-03-03 | 0.05 | 0.28 | 0.44 | 0.83 |
| 2017-03-06 | 0.05 | 0.28 | 0.44 | 0.86 |
| 2017-03-07 | 0.05 | 0.28 | 0.44 | 0.87 |
| 2017-03-08 | 0.05 | 0.28 | 0.44 | 0.96 |
| 2017-03-09 | 0.05 | 0.28 | 0.44 | 0.98 |
| 2017-03-10 | 0.05 | 0.28 | 0.44 | 0.99 |
| 2017-03-13 | 0.05 | 0.28 | 0.44 | 1 |
| 2017-03-14 | 0.05 | 0.28 | 0.44 | 1 |
| 2017-03-15 | 0.05 | 0.28 | 0.44 | 0.99 |
| 2017-03-16 | 0.05 | 0.28 | 0.44 | 0.99 |
| 2017-03-17 | 0.05 | 0.28 | 0.44 | 0.99 |
| 2017-03-20 | 0.05 | 0.28 | 0.44 | 0.96 |
| 2017-03-21 | 0.05 | 0.28 | 0.44 | 0.97 |
| 2017-03-22 | 0.05 | 0.28 | 0.44 | 0.9 |
| 2017-03-23 | 0.05 | 0.28 | 0.44 | 0.87 |
| 2017-03-24 | 0.05 | 0.28 | 0.44 | 0.92 |
| 2017-03-27 | 0.05 | 0.28 | 0.44 | 0.86 |
| 2017-03-28 | 0.05 | 0.28 | 0.44 | 0.84 |
| 2017-03-29 | 0.05 | 0.28 | 0.44 | 0.84 |
| 2017-03-30 | 0.05 | 0.28 | 0.44 | 0.8 |
| 2017-03-31 | 0.05 | 0.28 | 0.44 | 0.66 |
| 2017-04-03 | 0.05 | 0.28 | 0.44 | 0.71 |
| 2017-04-04 | 0.05 | 0.28 | 0.44 | 0.68 |
| 2017-04-05 | 0.05 | 0.28 | 0.44 | 0.73 |
| 2017-04-06 | 0.05 | 0.28 | 0.44 | 0.76 |
| 2017-04-07 | 0.05 | 0.29 | 0.44 | 0.89 |
| 2017-04-10 | 0.05 | 0.29 | 0.45 | 0.89 |
| 2017-04-11 | 0.05 | 0.29 | 0.45 | 0.91 |
| 2017-04-12 | 0.05 | 0.29 | 0.45 | 0.89 |
| 2017-04-13 | 0.05 | 0.29 | 0.45 | 0.88 |
| 2017-04-18 | 0.05 | 0.29 | 0.45 | 0.85 |
| 2017-04-19 | 0.05 | 0.29 | 0.45 | 0.82 |
| 2017-04-20 | 0.05 | 0.29 | 0.45 | 0.87 |
| 2017-04-21 | 0.05 | 0.29 | 0.45 | 0.88 |
| 2017-04-24 | 0.05 | 0.29 | 0.45 | 0.95 |
| 2017-04-25 | 0.05 | 0.29 | 0.45 | 0.93 |
| 2017-04-26 | 0.05 | 0.29 | 0.45 | 0.94 |
| 2017-04-27 | 0.05 | 0.29 | 0.45 | 0.99 |
| 2017-04-28 | 0.05 | 0.29 | 0.45 | 1.02 |
| 2017-05-02 | 0.05 | 0.29 | 0.45 | 1.02 |
| 2017-05-03 | 0.05 | 0.29 | 0.45 | 0.98 |
| 2017-05-04 | 0.05 | 0.29 | 0.45 | 1.01 |
| 2017-05-05 | 0.05 | 0.29 | 0.45 | 0.95 |
| 2017-05-09 | 0.05 | 0.29 | 0.46 | 0.97 |
| 2017-05-10 | 0.05 | 0.29 | 0.46 | 0.92 |
| 2017-05-11 | 0.05 | 0.3 | 0.46 | 0.94 |
| 2017-05-12 | 0.05 | 0.3 | 0.46 | 0.96 |
| 2017-05-15 | 0.05 | 0.3 | 0.46 | 0.96 |
| 2017-05-16 | 0.05 | 0.3 | 0.46 | 1 |
| 2017-05-17 | 0.05 | 0.3 | 0.46 | 0.97 |
| 2017-05-18 | 0.05 | 0.3 | 0.46 | 0.95 |
| 2017-05-19 | 0.05 | 0.3 | 0.46 | 0.96 |
| 2017-05-22 | 0.05 | 0.3 | 0.46 | 0.97 |
| 2017-05-23 | 0.05 | 0.3 | 0.46 | 0.94 |
| 2017-05-24 | 0.05 | 0.3 | 0.47 | 0.92 |
| 2017-05-25 | 0.05 | 0.3 | 0.47 | 0.89 |
| 2017-05-26 | 0.05 | 0.3 | 0.47 | 0.87 |
| 2017-05-29 | 0.05 | 0.3 | 0.47 | 0.87 |
| 2017-05-30 | 0.05 | 0.3 | 0.46 | 0.84 |
| 2017-05-31 | 0.05 | 0.3 | 0.46 | 0.82 |
| 2017-06-01 | 0.05 | 0.3 | 0.46 | 0.81 |
| 2017-06-02 | 0.05 | 0.29 | 0.46 | 0.81 |
| 2017-06-05 | 0.05 | 0.29 | 0.46 | 0.82 |
| 2017-06-06 | 0.05 | 0.29 | 0.46 | 0.82 |
| 2017-06-07 | 0.05 | 0.29 | 0.46 | 0.81 |
| 2017-06-08 | 0.05 | 0.29 | 0.46 | 0.85 |
| 2017-06-09 | 0.05 | 0.3 | 0.46 | 0.89 |
| 2017-06-12 | 0.05 | 0.3 | 0.46 | 0.86 |
| 2017-06-13 | 0.05 | 0.3 | 0.46 | 0.87 |
| 2017-06-14 | 0.05 | 0.3 | 0.46 | 0.87 |
| 2017-06-15 | 0.05 | 0.3 | 0.46 | 0.83 |
| 2017-06-16 | 0.05 | 0.3 | 0.46 | 0.88 |
| 2017-06-19 | 0.05 | 0.3 | 0.46 | 0.86 |
| 2017-06-20 | 0.05 | 0.3 | 0.46 | 0.86 |
| 2017-06-21 | 0.05 | 0.3 | 0.46 | 0.86 |
| 2017-06-22 | 0.05 | 0.3 | 0.46 | 0.86 |
| 2017-06-23 | 0.05 | 0.3 | 0.46 | 0.84 |
| 2017-06-26 | 0.05 | 0.3 | 0.46 | 0.83 |
| 2017-06-27 | 0.05 | 0.3 | 0.46 | 0.82 |
| 2017-06-28 | 0.05 | 0.3 | 0.46 | 0.89 |
| 2017-06-29 | 0.05 | 0.29 | 0.46 | 0.94 |
| 2017-06-30 | 0.05 | 0.3 | 0.46 | 0.97 |
| 2017-07-03 | 0.05 | 0.3 | 0.46 | 0.99 |
| 2017-07-04 | 0.05 | 0.3 | 0.46 | 0.98 |
| 2017-07-07 | 0.05 | 0.3 | 0.47 | 1.06 |
| 2017-07-10 | 0.05 | 0.3 | 0.47 | 1.08 |
| 2017-07-11 | 0.05 | 0.3 | 0.47 | 1.05 |
| 2017-07-12 | 0.05 | 0.3 | 0.47 | 1.05 |
| 2017-07-13 | 0.05 | 0.3 | 0.47 | 1.03 |
| 2017-07-14 | 0.05 | 0.3 | 0.47 | 1.03 |
| 2017-07-17 | 0.05 | 0.3 | 0.47 | 1.03 |
| 2017-07-18 | 0.05 | 0.3 | 0.47 | 1.03 |
| 2017-07-19 | 0.05 | 0.3 | 0.47 | 1.09 |
| 2017-07-20 | 0.05 | 0.3 | 0.48 | 1.1 |
| 2017-07-21 | 0.05 | 0.3 | 0.48 | 1.08 |
| 2017-07-24 | 0.05 | 0.3 | 0.48 | 1.08 |
| 2017-07-25 | 0.05 | 0.3 | 0.48 | 1.13 |
| 2017-07-26 | 0.05 | 0.3 | 0.48 | 1.14 |
| 2017-07-27 | 0.05 | 0.3 | 0.48 | 1.14 |
| 2017-07-28 | 0.05 | 0.31 | 0.48 | 1.15 |
| 2017-07-31 | 0.05 | 0.31 | 0.49 | 1.17 |
| 2017-08-01 | 0.05 | 0.31 | 0.49 | 1.18 |
| 2017-08-02 | 0.05 | 0.31 | 0.49 | 1.14 |
| 2017-08-03 | 0.05 | 0.31 | 0.49 | 1.16 |
| 2017-08-04 | 0.25 | 0.43 | 0.56 | 1.08 |
| 2017-08-07 | 0.25 | 0.44 | 0.59 | 1.07 |
| 2017-08-08 | 0.25 | 0.44 | 0.6 | 1.06 |
| 2017-08-09 | 0.25 | 0.45 | 0.6 | 1.09 |
| 2017-08-10 | 0.25 | 0.45 | 0.61 | 1.07 |
| 2017-08-11 | 0.25 | 0.45 | 0.61 | 1.09 |
| 2017-08-14 | 0.25 | 0.45 | 0.61 | 1.11 |
| 2017-08-15 | 0.25 | 0.45 | 0.61 | 1.11 |
| 2017-08-16 | 0.25 | 0.45 | 0.62 | 1.16 |
| 2017-08-17 | 0.25 | 0.46 | 0.62 | 1.14 |
| 2017-08-18 | 0.25 | 0.46 | 0.62 | 1.14 |
| 2017-08-21 | 0.25 | 0.46 | 0.62 | 1.14 |
| 2017-08-22 | 0.25 | 0.46 | 0.63 | 1.12 |
| 2017-08-23 | 0.25 | 0.46 | 0.63 | 1.13 |
| 2017-08-24 | 0.25 | 0.46 | 0.63 | 1.13 |
| 2017-08-25 | 0.25 | 0.46 | 0.63 | 1.14 |
| 2017-08-28 | 0.25 | 0.46 | 0.63 | 1.14 |
| 2017-08-29 | 0.25 | 0.46 | 0.63 | 1.14 |
| 2017-08-30 | 0.25 | 0.46 | 0.63 | 1.12 |
| 2017-08-31 | 0.25 | 0.46 | 0.63 | 1.14 |
| 2017-09-01 | 0.25 | 0.46 | 0.63 | 1.15 |
| 2017-09-04 | 0.25 | 0.46 | 0.63 | 1.19 |
| 2017-09-05 | 0.25 | 0.46 | 0.63 | 1.19 |
| 2017-09-06 | 0.25 | 0.46 | 0.63 | 1.17 |
| 2017-09-07 | 0.25 | 0.46 | 0.63 | 1.19 |
| 2017-09-08 | 0.25 | 0.46 | 0.63 | 1.2 |
| 2017-09-11 | 0.25 | 0.46 | 0.63 | 1.23 |
| 2017-09-12 | 0.25 | 0.46 | 0.64 | 1.24 |
| 2017-09-13 | 0.25 | 0.46 | 0.64 | 1.28 |
| 2017-09-14 | 0.25 | 0.46 | 0.64 | 1.28 |
| 2017-09-15 | 0.25 | 0.46 | 0.64 | 1.3 |
| 2017-09-18 | 0.25 | 0.46 | 0.64 | 1.3 |
| 2017-09-19 | 0.25 | 0.46 | 0.64 | 1.33 |
| 2017-09-20 | 0.25 | 0.46 | 0.64 | 1.32 |
| 2017-09-21 | 0.25 | 0.46 | 0.64 | 1.35 |
| 2017-09-22 | 0.25 | 0.46 | 0.64 | 1.32 |
| 2017-09-25 | 0.25 | 0.46 | 0.64 | 1.31 |
| 2017-09-26 | 0.25 | 0.46 | 0.64 | 1.3 |
| 2017-09-27 | 0.25 | 0.47 | 0.64 | 1.33 |
| 2017-09-29 | 0.25 | 0.47 | 0.65 | 1.37 |
| 2017-10-02 | 0.25 | 0.47 | 0.65 | 1.39 |
| 2017-10-03 | 0.25 | 0.47 | 0.65 | 1.39 |
| 2017-10-04 | 0.25 | 0.47 | 0.65 | 1.36 |
| 2017-10-05 | 0.25 | 0.48 | 0.66 | 1.32 |
| 2017-10-06 | 0.25 | 0.49 | 0.66 | 1.38 |
| 2017-10-09 | 0.25 | 0.49 | 0.67 | 1.36 |
| 2017-10-10 | 0.25 | 0.49 | 0.67 | 1.35 |
| 2017-10-11 | 0.25 | 0.49 | 0.66 | 1.37 |
| 2017-10-12 | 0.25 | 0.49 | 0.66 | 1.32 |
| 2017-10-13 | 0.25 | 0.5 | 0.67 | 1.35 |
| 2017-10-16 | 0.25 | 0.51 | 0.68 | 1.37 |
| 2017-10-17 | 0.25 | 0.51 | 0.69 | 1.4 |
| 2017-10-18 | 0.25 | 0.52 | 0.7 | 1.49 |
| 2017-10-19 | 0.25 | 0.52 | 0.71 | 1.45 |
| 2017-10-20 | 0.25 | 0.52 | 0.71 | 1.46 |
| 2017-10-23 | 0.25 | 0.53 | 0.72 | 1.47 |
| 2017-10-24 | 0.25 | 0.54 | 0.72 | 1.47 |
| 2017-10-25 | 0.25 | 0.54 | 0.73 | 1.53 |
| 2017-10-26 | 0.25 | 0.55 | 0.74 | 1.55 |
| 2017-10-27 | 0.25 | 0.56 | 0.74 | 1.56 |
| 2017-10-30 | 0.25 | 0.57 | 0.75 | 1.59 |
| 2017-10-31 | 0.25 | 0.58 | 0.77 | 1.52 |
| 2017-11-01 | 0.25 | 0.59 | 0.77 | 1.53 |
| 2017-11-02 | 0.25 | 0.61 | 0.79 | 1.59 |
| 2017-11-03 | 0.5 | 0.69 | 0.87 | 1.5 |
| 2017-11-06 | 0.5 | 0.7 | 0.89 | 1.48 |
| 2017-11-07 | 0.5 | 0.7 | 0.89 | 1.53 |
| 2017-11-08 | 0.5 | 0.71 | 0.89 | 1.52 |
| 2017-11-09 | 0.5 | 0.72 | 0.9 | 1.57 |
| 2017-11-10 | 0.5 | 0.72 | 0.91 | 1.61 |
| 2017-11-13 | 0.5 | 0.72 | 0.91 | 1.56 |
| 2017-11-14 | 0.5 | 0.72 | 0.92 | 1.59 |
| 2017-11-15 | 0.5 | 0.72 | 0.92 | 1.55 |
| 2017-11-16 | 0.5 | 0.72 | 0.93 | 1.63 |
| 2017-11-20 | 0.5 | 0.73 | 0.93 | 1.6 |
| 2017-11-21 | 0.5 | 0.73 | 0.94 | 1.65 |
| 2017-11-22 | 0.5 | 0.73 | 0.94 | 1.67 |
| 2017-11-23 | 0.5 | 0.73 | 0.94 | 1.68 |
| 2017-11-24 | 0.5 | 0.74 | 0.94 | 1.68 |
| 2017-11-27 | 0.5 | 0.74 | 0.94 | 1.68 |
| 2017-11-28 | 0.5 | 0.74 | 0.94 | 1.68 |
| 2017-11-29 | 0.5 | 0.74 | 0.95 | 1.65 |
| 2017-11-30 | 0.5 | 0.74 | 0.95 | 1.66 |
| 2017-12-01 | 0.5 | 0.74 | 0.94 | 1.6 |
| 2017-12-04 | 0.5 | 0.74 | 0.95 | 1.6 |
| 2017-12-05 | 0.5 | 0.74 | 0.95 | 1.59 |
| 2017-12-06 | 0.5 | 0.74 | 0.95 | 1.58 |
| 2017-12-07 | 0.5 | 0.74 | 0.95 | 1.57 |
| 2017-12-08 | 0.5 | 0.75 | 0.95 | 1.57 |
| 2017-12-11 | 0.5 | 0.75 | 0.95 | 1.59 |
| 2017-12-12 | 0.5 | 0.75 | 0.95 | 1.59 |
| 2017-12-13 | 0.5 | 0.75 | 0.96 | 1.64 |
| 2017-12-14 | 0.5 | 0.76 | 0.97 | 1.66 |
| 2017-12-15 | 0.5 | 0.76 | 0.97 | 1.66 |
| 2017-12-18 | 0.5 | 0.76 | 0.97 | 1.66 |
| 2017-12-19 | 0.5 | 0.76 | 0.97 | 1.65 |
| 2017-12-20 | 0.5 | 0.76 | 0.97 | 1.66 |
| 2017-12-21 | 0.5 | 0.76 | 0.97 | 1.66 |
| 2017-12-22 | 0.5 | 0.76 | 0.97 | 1.66 |
| 2017-12-27 | 0.5 | 0.76 | 0.97 | 1.63 |
| 2017-12-28 | 0.5 | 0.76 | 0.97 | 1.64 |
| 2017-12-29 | 0.5 | 0.76 | 0.97 | 1.64 |
| 2018-01-02 | 0.5 | 0.76 | 0.97 | 1.7 |
| 2018-01-03 | 0.5 | 0.76 | 0.97 | 1.69 |
| 2018-01-04 | 0.5 | 0.76 | 0.97 | 1.68 |
| 2018-01-05 | 0.5 | 0.76 | 0.97 | 1.65 |
| 2018-01-08 | 0.5 | 0.76 | 0.97 | 1.63 |
| 2018-01-09 | 0.5 | 0.76 | 0.97 | 1.63 |
| 2018-01-10 | 0.5 | 0.76 | 0.97 | 1.6 |
| 2018-01-11 | 0.5 | 0.78 | 0.99 | 1.59 |
| 2018-01-12 | 0.5 | 0.76 | 0.97 | 1.63 |
| 2018-01-15 | 0.5 | 0.76 | 0.97 | 1.65 |
| 2018-01-16 | 0.5 | 0.76 | 0.97 | 1.66 |
| 2018-01-17 | 0.5 | 0.77 | 0.98 | 1.69 |
| 2018-01-18 | 0.5 | 0.77 | 0.98 | 1.75 |
| 2018-01-19 | 0.5 | 0.77 | 0.98 | 1.77 |
| 2018-01-22 | 0.5 | 0.77 | 0.98 | 1.77 |
| 2018-01-23 | 0.5 | 0.77 | 0.98 | 1.75 |
| 2018-01-24 | 0.5 | 0.77 | 0.98 | 1.75 |
| 2018-01-25 | 0.5 | 0.78 | 0.99 | 1.75 |
| 2018-01-26 | 0.5 | 0.78 | 0.99 | 1.79 |
| 2018-01-29 | 0.5 | 0.79 | 1 | 1.86 |
| 2018-01-30 | 0.5 | 0.81 | 1.01 | 1.84 |
| 2018-01-31 | 0.5 | 0.81 | 1.02 | 1.82 |
| 2018-02-01 | 0.5 | 0.83 | 1.03 | 1.86 |
| 2018-02-02 | 0.75 | 0.91 | 1.11 | 1.9 |
| 2018-02-05 | 0.75 | 0.91 | 1.11 | 1.86 |
| 2018-02-06 | 0.75 | 0.91 | 1.11 | 1.8 |
| 2018-02-07 | 0.75 | 0.91 | 1.11 | 1.79 |
| 2018-02-08 | 0.75 | 0.91 | 1.11 | 1.81 |
| 2018-02-09 | 0.75 | 0.9 | 1.11 | 1.75 |
| 2018-02-12 | 0.75 | 0.9 | 1.11 | 1.77 |
| 2018-02-13 | 0.75 | 0.9 | 1.11 | 1.75 |
| 2018-02-14 | 0.75 | 0.9 | 1.11 | 1.72 |
| 2018-02-15 | 0.75 | 0.9 | 1.11 | 1.76 |
| 2018-02-16 | 0.75 | 0.9 | 1.11 | 1.73 |
| 2018-02-19 | 0.75 | 0.91 | 1.11 | 1.72 |
| 2018-02-20 | 0.75 | 0.91 | 1.11 | 1.76 |
| 2018-02-21 | 0.75 | 0.91 | 1.11 | 1.73 |
| 2018-02-22 | 0.75 | 0.91 | 1.12 | 1.71 |
| 2018-02-23 | 0.75 | 0.91 | 1.12 | 1.71 |
| 2018-02-26 | 0.75 | 0.91 | 1.12 | 1.69 |
| 2018-02-27 | 0.75 | 0.91 | 1.12 | 1.71 |
| 2018-02-28 | 0.75 | 0.91 | 1.12 | 1.73 |
| 2018-03-01 | 0.75 | 0.91 | 1.12 | 1.7 |
| 2018-03-02 | 0.75 | 0.91 | 1.12 | 1.68 |
| 2018-03-05 | 0.75 | 0.91 | 1.12 | 1.67 |
| 2018-03-06 | 0.75 | 0.91 | 1.12 | 1.69 |
| 2018-03-07 | 0.75 | 0.91 | 1.12 | 1.69 |
| 2018-03-08 | 0.75 | 0.91 | 1.12 | 1.71 |
| 2018-03-09 | 0.75 | 0.9 | 1.12 | 1.68 |
| 2018-03-12 | 0.75 | 0.9 | 1.12 | 1.67 |
| 2018-03-13 | 0.75 | 0.9 | 1.12 | 1.67 |
| 2018-03-14 | 0.75 | 0.9 | 1.12 | 1.67 |
| 2018-03-15 | 0.75 | 0.9 | 1.12 | 1.7 |
| 2018-03-16 | 0.75 | 0.9 | 1.12 | 1.7 |
| 2018-03-19 | 0.75 | 0.9 | 1.12 | 1.71 |
| 2018-03-20 | 0.75 | 0.9 | 1.12 | 1.72 |
| 2018-03-21 | 0.75 | 0.9 | 1.12 | 1.76 |
| 2018-03-22 | 0.75 | 0.9 | 1.12 | 1.75 |
| 2018-03-23 | 0.75 | 0.9 | 1.12 | 1.73 |
| 2018-03-26 | 0.75 | 0.9 | 1.12 | 1.71 |
| 2018-03-27 | 0.75 | 0.9 | 1.12 | 1.69 |
| 2018-03-28 | 0.75 | 0.9 | 1.12 | 1.64 |
| 2018-03-29 | 0.75 | 0.9 | 1.12 | 1.65 |
| 2018-04-03 | 0.75 | 0.9 | 1.12 | 1.66 |
| 2018-04-04 | 0.75 | 0.9 | 1.12 | 1.66 |
| 2018-04-05 | 0.75 | 0.9 | 1.12 | 1.68 |
| 2018-04-06 | 0.75 | 0.9 | 1.12 | 1.66 |
| 2018-04-09 | 0.75 | 0.9 | 1.12 | 1.65 |
| 2018-04-10 | 0.75 | 0.9 | 1.12 | 1.65 |
| 2018-04-11 | 0.75 | 0.9 | 1.12 | 1.63 |
| 2018-04-12 | 0.75 | 0.9 | 1.12 | 1.62 |
| 2018-04-13 | 0.75 | 0.9 | 1.12 | 1.64 |
| 2018-04-16 | 0.75 | 0.9 | 1.12 | 1.64 |
| 2018-04-17 | 0.75 | 0.9 | 1.13 | 1.63 |
| 2018-04-18 | 0.75 | 0.9 | 1.12 | 1.61 |
| 2018-04-19 | 0.75 | 0.9 | 1.12 | 1.62 |
| 2018-04-20 | 0.75 | 0.9 | 1.12 | 1.63 |
| 2018-04-23 | 0.75 | 0.9 | 1.12 | 1.66 |
| 2018-04-24 | 0.75 | 0.9 | 1.12 | 1.65 |
| 2018-04-25 | 0.75 | 0.9 | 1.12 | 1.66 |
| 2018-04-26 | 0.75 | 0.9 | 1.12 | 1.66 |
| 2018-04-27 | 0.75 | 0.9 | 1.12 | 1.62 |
| 2018-04-30 | 0.75 | 0.9 | 1.12 | 1.62 |
| 2018-05-02 | 0.75 | 0.9 | 1.12 | 1.64 |
| 2018-05-03 | 0.75 | 0.9 | 1.12 | 1.67 |
| 2018-05-04 | 0.75 | 0.9 | 1.12 | 1.68 |
| 2018-05-07 | 0.75 | 0.9 | 1.12 | 1.68 |
| 2018-05-09 | 0.75 | 0.9 | 1.12 | 1.74 |
| 2018-05-10 | 0.75 | 0.9 | 1.12 | 1.76 |
| 2018-05-11 | 0.75 | 0.9 | 1.12 | 1.76 |
| 2018-05-14 | 0.75 | 0.9 | 1.12 | 1.8 |
| 2018-05-15 | 0.75 | 0.9 | 1.12 | 1.82 |
| 2018-05-16 | 0.75 | 0.9 | 1.12 | 1.84 |
| 2018-05-17 | 0.75 | 0.9 | 1.12 | 1.86 |
| 2018-05-18 | 0.75 | 0.9 | 1.12 | 1.84 |
| 2018-05-21 | 0.75 | 0.9 | 1.12 | 1.87 |
| 2018-05-22 | 0.75 | 0.9 | 1.12 | 1.89 |
| 2018-05-23 | 0.75 | 0.9 | 1.12 | 1.85 |
| 2018-05-24 | 0.75 | 0.9 | 1.12 | 1.82 |
| 2018-05-25 | 0.75 | 0.9 | 1.12 | 1.79 |
| 2018-05-28 | 0.75 | 0.9 | 1.12 | 1.76 |
| 2018-05-29 | 0.75 | 0.9 | 1.12 | 1.7 |
| 2018-05-30 | 0.75 | 0.9 | 1.12 | 1.68 |
| 2018-05-31 | 0.75 | 0.9 | 1.12 | 1.73 |
| 2018-06-01 | 0.75 | 0.9 | 1.12 | 1.72 |
| 2018-06-04 | 0.75 | 0.9 | 1.12 | 1.73 |
| 2018-06-05 | 0.75 | 0.9 | 1.12 | 1.76 |
| 2018-06-06 | 0.75 | 0.9 | 1.12 | 1.83 |
| 2018-06-07 | 0.75 | 0.9 | 1.12 | 1.86 |
| 2018-06-08 | 0.75 | 0.9 | 1.12 | 1.84 |
| 2018-06-11 | 0.75 | 0.92 | 1.13 | 1.93 |
| 2018-06-12 | 0.75 | 0.92 | 1.14 | 1.93 |
| 2018-06-13 | 0.75 | 0.92 | 1.14 | 1.91 |
| 2018-06-14 | 0.75 | 0.93 | 1.14 | 1.94 |
| 2018-06-15 | 0.75 | 0.92 | 1.14 | 1.94 |
| 2018-06-18 | 0.75 | 0.93 | 1.15 | 1.91 |
| 2018-06-19 | 0.75 | 0.93 | 1.15 | 1.87 |
| 2018-06-20 | 0.75 | 0.93 | 1.15 | 1.85 |
| 2018-06-21 | 0.75 | 0.93 | 1.15 | 1.85 |
| 2018-06-22 | 0.75 | 0.93 | 1.16 | 1.85 |
| 2018-06-25 | 0.75 | 0.93 | 1.16 | 1.8 |
| 2018-06-26 | 0.75 | 0.93 | 1.16 | 1.84 |
| 2018-06-27 | 0.75 | 0.93 | 1.16 | 1.82 |
| 2018-06-28 | 1 | 1.16 | 1.35 | 1.94 |
| 2018-06-29 | 1 | 1.16 | 1.35 | 1.94 |
| 2018-07-02 | 1 | 1.16 | 1.35 | 1.92 |
| 2018-07-03 | 1 | 1.16 | 1.35 | 1.97 |
| 2018-07-04 | 1 | 1.17 | 1.36 | 2 |
| 2018-07-09 | 1 | 1.17 | 1.37 | 1.92 |
| 2018-07-10 | 1 | 1.17 | 1.37 | 1.94 |
| 2018-07-11 | 1 | 1.18 | 1.38 | 2.02 |
| 2018-07-12 | 1 | 1.18 | 1.38 | 2.02 |
| 2018-07-13 | 1 | 1.18 | 1.39 | 2.05 |
| 2018-07-16 | 1 | 1.18 | 1.39 | 2.03 |
| 2018-07-17 | 1 | 1.19 | 1.4 | 2.03 |
| 2018-07-18 | 1 | 1.18 | 1.39 | 2.01 |
| 2018-07-19 | 1 | 1.19 | 1.39 | 2.02 |
| 2018-07-20 | 1 | 1.18 | 1.39 | 2.01 |
| 2018-07-23 | 1 | 1.19 | 1.39 | 2.03 |
| 2018-07-24 | 1 | 1.19 | 1.4 | 2.08 |
| 2018-07-25 | 1 | 1.2 | 1.41 | 2.09 |
| 2018-07-26 | 1 | 1.2 | 1.41 | 2.12 |
| 2018-07-27 | 1 | 1.2 | 1.41 | 2.15 |
| 2018-07-30 | 1 | 1.21 | 1.43 | 2.15 |
| 2018-07-31 | 1 | 1.22 | 1.43 | 2.17 |
| 2018-08-01 | 1 | 1.23 | 1.45 | 2.18 |
| 2018-08-02 | 1 | 1.24 | 1.45 | 2.17 |
| 2018-08-03 | 1.25 | 1.42 | 1.61 | 2.21 |
| 2018-08-06 | 1.25 | 1.44 | 1.64 | 2.19 |
| 2018-08-07 | 1.25 | 1.45 | 1.65 | 2.19 |
| 2018-08-08 | 1.25 | 1.45 | 1.66 | 2.19 |
| 2018-08-09 | 1.25 | 1.46 | 1.67 | 2.17 |
| 2018-08-10 | 1.25 | 1.46 | 1.67 | 2.18 |
| 2018-08-13 | 1.25 | 1.46 | 1.68 | 2.15 |
| 2018-08-14 | 1.25 | 1.46 | 1.68 | 2.13 |
| 2018-08-15 | 1.25 | 1.46 | 1.68 | 2.16 |
| 2018-08-16 | 1.25 | 1.46 | 1.68 | 2.17 |
| 2018-08-17 | 1.25 | 1.47 | 1.68 | 2.18 |
| 2018-08-20 | 1.25 | 1.47 | 1.69 | 2.2 |
| 2018-08-21 | 1.25 | 1.48 | 1.7 | 2.22 |
| 2018-08-22 | 1.25 | 1.48 | 1.71 | 2.22 |
| 2018-08-23 | 1.25 | 1.48 | 1.71 | 2.23 |
| 2018-08-24 | 1.25 | 1.48 | 1.71 | 2.24 |
| 2018-08-27 | 1.25 | 1.49 | 1.71 | 2.24 |
| 2018-08-28 | 1.25 | 1.49 | 1.72 | 2.24 |
| 2018-08-29 | 1.25 | 1.49 | 1.72 | 2.24 |
| 2018-08-30 | 1.25 | 1.49 | 1.73 | 2.24 |
| 2018-08-31 | 1.25 | 1.5 | 1.73 | 2.23 |
| 2018-09-03 | 1.25 | 1.5 | 1.73 | 2.23 |
| 2018-09-04 | 1.25 | 1.5 | 1.74 | 2.25 |
| 2018-09-05 | 1.25 | 1.51 | 1.74 | 2.29 |
| 2018-09-06 | 1.25 | 1.51 | 1.75 | 2.3 |
| 2018-09-07 | 1.25 | 1.51 | 1.74 | 2.3 |
| 2018-09-10 | 1.25 | 1.51 | 1.75 | 2.3 |
| 2018-09-11 | 1.25 | 1.52 | 1.77 | 2.37 |
| 2018-09-12 | 1.25 | 1.53 | 1.78 | 2.4 |
| 2018-09-13 | 1.25 | 1.54 | 1.78 | 2.39 |
| 2018-09-14 | 1.25 | 1.54 | 1.79 | 2.39 |
| 2018-09-17 | 1.25 | 1.54 | 1.79 | 2.39 |
| 2018-09-18 | 1.25 | 1.55 | 1.8 | 2.39 |
| 2018-09-19 | 1.25 | 1.56 | 1.81 | 2.42 |
| 2018-09-20 | 1.25 | 1.56 | 1.81 | 2.44 |
| 2018-09-21 | 1.25 | 1.56 | 1.82 | 2.43 |
| 2018-09-24 | 1.25 | 1.56 | 1.82 | 2.43 |
| 2018-09-25 | 1.25 | 1.57 | 1.82 | 2.46 |
| 2018-09-26 | 1.25 | 1.58 | 1.83 | 2.46 |
| 2018-09-27 | 1.5 | 1.7 | 1.89 | 2.43 |
| 2018-10-01 | 1.5 | 1.72 | 1.9 | 2.43 |
| 2018-10-02 | 1.5 | 1.73 | 1.91 | 2.43 |
| 2018-10-03 | 1.5 | 1.73 | 1.92 | 2.5 |
| 2018-10-04 | 1.5 | 1.74 | 1.93 | 2.57 |
| 2018-10-05 | 1.5 | 1.74 | 1.93 | 2.56 |
| 2018-10-08 | 1.5 | 1.74 | 1.93 | 2.56 |
| 2018-10-09 | 1.5 | 1.75 | 1.93 | 2.6 |
| 2018-10-10 | 1.5 | 1.75 | 1.94 | 2.61 |
| 2018-10-11 | 1.5 | 1.75 | 1.95 | 2.61 |
| 2018-10-12 | 1.5 | 1.75 | 1.96 | 2.63 |
| 2018-10-15 | 1.5 | 1.76 | 1.96 | 2.64 |
| 2018-10-16 | 1.5 | 1.76 | 1.97 | 2.66 |
| 2018-10-17 | 1.5 | 1.76 | 1.97 | 2.65 |
| 2018-10-18 | 1.5 | 1.76 | 1.97 | 2.66 |
| 2018-10-19 | 1.5 | 1.77 | 1.97 | 2.64 |
| 2018-10-22 | 1.5 | 1.77 | 1.97 | 2.67 |
| 2018-10-23 | 1.5 | 1.77 | 1.98 | 2.64 |
| 2018-10-24 | 1.5 | 1.78 | 1.98 | 2.57 |
| 2018-10-25 | 1.5 | 1.78 | 1.97 | 2.56 |
| 2018-10-26 | 1.5 | 1.79 | 1.98 | 2.56 |
| 2018-10-29 | 1.5 | 1.8 | 1.99 | 2.55 |
| 2018-10-30 | 1.5 | 1.8 | 1.99 | 2.56 |
| 2018-10-31 | 1.5 | 1.81 | 2 | 2.58 |
| 2018-11-01 | 1.5 | 1.82 | 2.01 | 2.6 |
| 2018-11-02 | 1.75 | 1.96 | 2.14 | 2.58 |
| 2018-11-05 | 1.75 | 1.97 | 2.14 | 2.57 |
| 2018-11-06 | 1.75 | 1.97 | 2.15 | 2.52 |
| 2018-11-07 | 1.75 | 1.97 | 2.16 | 2.56 |
| 2018-11-08 | 1.75 | 1.98 | 2.17 | 2.6 |
| 2018-11-09 | 1.75 | 1.99 | 2.18 | 2.6 |
| 2018-11-12 | 1.75 | 1.99 | 2.18 | 2.6 |
| 2018-11-13 | 1.75 | 1.99 | 2.18 | 2.62 |
| 2018-11-14 | 1.75 | 1.99 | 2.19 | 2.58 |
| 2018-11-15 | 1.75 | 2 | 2.2 | 2.56 |
| 2018-11-16 | 1.75 | 2 | 2.2 | 2.56 |
| 2018-11-19 | 1.75 | 2 | 2.2 | 2.55 |
| 2018-11-20 | 1.75 | 2.01 | 2.21 | 2.53 |
| 2018-11-21 | 1.75 | 2.01 | 2.21 | 2.51 |
| 2018-11-22 | 1.75 | 2.01 | 2.21 | 2.48 |
| 2018-11-23 | 1.75 | 2.02 | 2.22 | 2.49 |
| 2018-11-26 | 1.75 | 2.02 | 2.22 | 2.46 |
| 2018-11-27 | 1.75 | 2.02 | 2.22 | 2.4 |
| 2018-11-28 | 1.75 | 2.02 | 2.22 | 2.4 |
| 2018-11-29 | 1.75 | 2.02 | 2.22 | 2.42 |
| 2018-11-30 | 1.75 | 2.02 | 2.22 | 2.41 |
| 2018-12-03 | 1.75 | 2.01 | 2.21 | 2.47 |
| 2018-12-04 | 1.75 | 2.01 | 2.21 | 2.4 |
| 2018-12-05 | 1.75 | 2.01 | 2.21 | 2.37 |
| 2018-12-06 | 1.75 | 2.01 | 2.21 | 2.37 |
| 2018-12-07 | 1.75 | 2.01 | 2.21 | 2.36 |
| 2018-12-10 | 1.75 | 2.01 | 2.21 | 2.34 |
| 2018-12-11 | 1.75 | 2.01 | 2.21 | 2.32 |
| 2018-12-12 | 1.75 | 2.01 | 2.21 | 2.34 |
| 2018-12-13 | 1.75 | 2.02 | 2.21 | 2.36 |
| 2018-12-14 | 1.75 | 2.02 | 2.21 | 2.35 |
| 2018-12-17 | 1.75 | 2.02 | 2.21 | 2.33 |
| 2018-12-18 | 1.75 | 2.02 | 2.21 | 2.3 |
| 2018-12-19 | 1.75 | 2.02 | 2.21 | 2.29 |
| 2018-12-20 | 1.75 | 2.02 | 2.21 | 2.11 |
| 2018-12-21 | 1.75 | 2.02 | 2.21 | 2.06 |
| 2018-12-27 | 1.75 | 2.01 | 2.2 | 1.99 |
| 2018-12-28 | 1.75 | 2.02 | 2.21 | 1.86 |
| 2018-12-31 | 1.75 | 2.01 | 2.21 | 1.85 |
| 2019-01-02 | 1.75 | 2.01 | 2.2 | 1.75 |
| 2019-01-03 | 1.75 | 2.01 | 2.2 | 1.74 |
| 2019-01-04 | 1.75 | 2.01 | 2.21 | 1.83 |
| 2019-01-07 | 1.75 | 2.01 | 2.21 | 1.88 |
| 2019-01-08 | 1.75 | 2.01 | 2.21 | 1.9 |
| 2019-01-09 | 1.75 | 2.01 | 2.21 | 2 |
| 2019-01-10 | 1.75 | 2.01 | 2.21 | 1.97 |
| 2019-01-11 | 1.75 | 2.01 | 2.21 | 1.94 |
| 2019-01-14 | 1.75 | 2.01 | 2.21 | 1.88 |
| 2019-01-15 | 1.75 | 2.01 | 2.21 | 1.77 |
| 2019-01-16 | 1.75 | 2.01 | 2.21 | 1.88 |
| 2019-01-17 | 1.75 | 2.01 | 2.21 | 1.94 |
| 2019-01-18 | 1.75 | 2.01 | 2.22 | 2.01 |
| 2019-01-21 | 1.75 | 2.01 | 2.22 | 1.99 |
| 2019-01-22 | 1.75 | 2.01 | 2.22 | 1.99 |
| 2019-01-23 | 1.75 | 2.01 | 2.22 | 1.96 |
| 2019-01-24 | 1.75 | 2 | 2.22 | 1.97 |
| 2019-01-25 | 1.75 | 2 | 2.22 | 1.93 |
| 2019-01-28 | 1.75 | 2 | 2.22 | 1.93 |
| 2019-01-29 | 1.75 | 1.99 | 2.22 | 1.96 |
| 2019-01-30 | 1.75 | 1.99 | 2.21 | 1.93 |
| 2019-01-31 | 1.75 | 1.99 | 2.21 | 1.86 |
| 2019-02-01 | 1.75 | 1.99 | 2.21 | 1.86 |
| 2019-02-04 | 1.75 | 1.99 | 2.2 | 1.84 |
| 2019-02-05 | 1.75 | 1.99 | 2.2 | 1.83 |
| 2019-02-06 | 1.75 | 1.99 | 2.2 | 1.82 |
| 2019-02-07 | 1.75 | 1.99 | 2.2 | 1.79 |
| 2019-02-08 | 1.75 | 1.99 | 2.2 | 1.78 |
| 2019-02-11 | 1.75 | 1.99 | 2.2 | 1.76 |
| 2019-02-12 | 1.75 | 1.99 | 2.2 | 1.78 |
| 2019-02-13 | 1.75 | 2 | 2.19 | 1.83 |
| 2019-02-14 | 1.75 | 2 | 2.19 | 1.9 |
| 2019-02-15 | 1.75 | 2.01 | 2.19 | 1.93 |
| 2019-02-18 | 1.75 | 2.02 | 2.19 | 1.97 |
| 2019-02-19 | 1.75 | 2.02 | 2.19 | 1.98 |
| 2019-02-20 | 1.75 | 2.02 | 2.19 | 1.92 |
| 2019-02-21 | 1.75 | 2.02 | 2.19 | 1.95 |
| 2019-02-22 | 1.75 | 2.02 | 2.19 | 1.98 |
| 2019-02-25 | 1.75 | 2.02 | 2.2 | 1.99 |
| 2019-02-26 | 1.75 | 2.02 | 2.2 | 2 |
| 2019-02-27 | 1.75 | 2.02 | 2.2 | 2.02 |
| 2019-02-28 | 1.75 | 2.02 | 2.2 | 2.06 |
| 2019-03-01 | 1.75 | 2.03 | 2.2 | 2.07 |
| 2019-03-04 | 1.75 | 2.03 | 2.2 | 2.1 |
| 2019-03-05 | 1.75 | 2.03 | 2.2 | 2.1 |
| 2019-03-06 | 1.75 | 2.03 | 2.2 | 2.07 |
| 2019-03-07 | 1.75 | 2.03 | 2.21 | 2.06 |
| 2019-03-08 | 1.75 | 2.03 | 2.2 | 1.99 |
| 2019-03-11 | 1.75 | 2.03 | 2.2 | 1.99 |
| 2019-03-12 | 1.75 | 2.03 | 2.2 | 1.99 |
| 2019-03-13 | 1.75 | 2.03 | 2.2 | 1.96 |
| 2019-03-14 | 1.75 | 2.03 | 2.2 | 1.98 |
| 2019-03-15 | 1.75 | 2.03 | 2.2 | 2.02 |
| 2019-03-18 | 1.75 | 2.03 | 2.2 | 2.04 |
| 2019-03-19 | 1.75 | 2.03 | 2.2 | 2.05 |
| 2019-03-20 | 1.75 | 2.03 | 2.2 | 2.06 |
| 2019-03-21 | 1.75 | 2.03 | 2.2 | 1.98 |
| 2019-03-22 | 1.75 | 2.03 | 2.2 | 1.93 |
| 2019-03-25 | 1.75 | 2.02 | 2.2 | 1.87 |
| 2019-03-26 | 1.75 | 2.02 | 2.2 | 1.87 |
| 2019-03-27 | 1.75 | 2.02 | 2.2 | 1.86 |
| 2019-03-28 | 1.75 | 2.02 | 2.2 | 1.8 |
| 2019-03-29 | 1.75 | 2.02 | 2.2 | 1.83 |
| 2019-04-01 | 1.75 | 2.02 | 2.2 | 1.84 |
| 2019-04-02 | 1.75 | 2.02 | 2.2 | 1.87 |
| 2019-04-03 | 1.75 | 2.02 | 2.2 | 1.93 |
| 2019-04-04 | 1.75 | 2.02 | 2.2 | 1.94 |
| 2019-04-05 | 1.75 | 2.02 | 2.2 | 1.99 |
| 2019-04-08 | 1.75 | 2.02 | 2.2 | 1.98 |
| 2019-04-09 | 1.75 | 2.02 | 2.2 | 1.97 |
| 2019-04-10 | 1.75 | 2.02 | 2.2 | 1.97 |
| 2019-04-11 | 1.75 | 2.02 | 2.2 | 1.93 |
| 2019-04-12 | 1.75 | 2.02 | 2.21 | 1.95 |
| 2019-04-15 | 1.75 | 2.02 | 2.21 | 1.97 |
| 2019-04-16 | 1.75 | 2.02 | 2.21 | 1.96 |
| 2019-04-17 | 1.75 | 2.02 | 2.21 | 1.98 |
| 2019-04-18 | 1.75 | 2.02 | 2.21 | 1.98 |
| 2019-04-23 | 1.75 | 2.02 | 2.22 | 1.96 |
| 2019-04-24 | 1.75 | 2.02 | 2.22 | 1.99 |
| 2019-04-25 | 1.75 | 2.02 | 2.22 | 2 |
| 2019-04-26 | 1.75 | 2.03 | 2.23 | 2.06 |
| 2019-04-29 | 1.75 | 2.04 | 2.23 | 2.06 |
| 2019-04-30 | 1.75 | 2.05 | 2.23 | 2.13 |
| 2019-05-02 | 1.75 | 2.05 | 2.23 | 2.13 |
| 2019-05-03 | 2 | 2.2 | 2.34 | 2.12 |
| 2019-05-06 | 2 | 2.21 | 2.34 | 2.09 |
| 2019-05-07 | 2 | 2.21 | 2.34 | 2.08 |
| 2019-05-09 | 2 | 2.21 | 2.34 | 2.06 |
| 2019-05-10 | 2 | 2.2 | 2.34 | 2.08 |
| 2019-05-13 | 2 | 2.2 | 2.33 | 2.05 |
| 2019-05-14 | 2 | 2.2 | 2.33 | 2.02 |
| 2019-05-15 | 2 | 2.2 | 2.32 | 1.95 |
| 2019-05-16 | 2 | 2.2 | 2.32 | 1.95 |
| 2019-05-17 | 2 | 2.2 | 2.32 | 1.96 |
| 2019-05-20 | 2 | 2.2 | 2.32 | 1.97 |
| 2019-05-21 | 2 | 2.2 | 2.32 | 1.96 |
| 2019-05-22 | 2 | 2.2 | 2.32 | 1.92 |
| 2019-05-23 | 2 | 2.19 | 2.31 | 1.88 |
| 2019-05-24 | 2 | 2.19 | 2.31 | 1.88 |
| 2019-05-27 | 2 | 2.19 | 2.31 | 1.9 |
| 2019-05-28 | 2 | 2.19 | 2.31 | 1.88 |
| 2019-05-29 | 2 | 2.19 | 2.31 | 1.87 |
| 2019-05-30 | 2 | 2.19 | 2.31 | 1.86 |
| 2019-05-31 | 2 | 2.19 | 2.31 | 1.79 |
| 2019-06-03 | 2 | 2.19 | 2.31 | 1.77 |
| 2019-06-04 | 2 | 2.18 | 2.3 | 1.78 |
| 2019-06-05 | 2 | 2.18 | 2.3 | 1.82 |
| 2019-06-06 | 2 | 2.18 | 2.3 | 1.79 |
| 2019-06-07 | 2 | 2.18 | 2.3 | 1.8 |
| 2019-06-10 | 2 | 2.17 | 2.29 | 1.79 |
| 2019-06-11 | 2 | 2.17 | 2.29 | 1.81 |
| 2019-06-12 | 2 | 2.17 | 2.29 | 1.77 |
| 2019-06-13 | 2 | 2.17 | 2.29 | 1.73 |
| 2019-06-14 | 2 | 2.17 | 2.29 | 1.68 |
| 2019-06-17 | 2 | 2.17 | 2.29 | 1.7 |
| 2019-06-18 | 2 | 2.17 | 2.29 | 1.66 |
| 2019-06-19 | 2 | 2.17 | 2.29 | 1.66 |
| 2019-06-20 | 2 | 2.17 | 2.29 | 1.65 |
| 2019-06-21 | 2 | 2.17 | 2.29 | 1.67 |
| 2019-06-24 | 2 | 2.17 | 2.29 | 1.68 |
| 2019-06-25 | 2 | 2.17 | 2.29 | 1.68 |
| 2019-06-26 | 2 | 2.17 | 2.29 | 1.69 |
| 2019-06-27 | 2 | 2.17 | 2.29 | 1.72 |
| 2019-06-28 | 2 | 2.17 | 2.29 | 1.69 |
| 2019-07-01 | 2 | 2.17 | 2.29 | 1.68 |
| 2019-07-02 | 2 | 2.17 | 2.29 | 1.67 |
| 2019-07-03 | 2 | 2.17 | 2.29 | 1.59 |
| 2019-07-04 | 2 | 2.17 | 2.29 | 1.59 |
| 2019-07-08 | 2 | 2.17 | 2.29 | 1.63 |
| 2019-07-09 | 2 | 2.17 | 2.28 | 1.6 |
| 2019-07-10 | 2 | 2.17 | 2.28 | 1.63 |
| 2019-07-11 | 2 | 2.17 | 2.28 | 1.62 |
| 2019-07-12 | 2 | 2.17 | 2.28 | 1.72 |
| 2019-07-15 | 2 | 2.16 | 2.28 | 1.7 |
| 2019-07-16 | 2 | 2.16 | 2.28 | 1.7 |
| 2019-07-17 | 2 | 2.16 | 2.28 | 1.7 |
| 2019-07-18 | 2 | 2.16 | 2.28 | 1.7 |
| 2019-07-19 | 2 | 2.16 | 2.28 | 1.7 |
| 2019-07-22 | 2 | 2.16 | 2.28 | 1.7 |
| 2019-07-23 | 2 | 2.16 | 2.28 | 1.69 |
| 2019-07-24 | 2 | 2.16 | 2.28 | 1.59 |
| 2019-07-25 | 2 | 2.16 | 2.28 | 1.56 |
| 2019-07-26 | 2 | 2.16 | 2.27 | 1.6 |
| 2019-07-29 | 2 | 2.16 | 2.27 | 1.6 |
| 2019-07-30 | 2 | 2.16 | 2.27 | 1.61 |
| 2019-07-31 | 2 | 2.16 | 2.27 | 1.62 |
| 2019-08-01 | 2 | 2.16 | 2.27 | 1.62 |
| 2019-08-02 | 2 | 2.16 | 2.26 | 1.54 |
| 2019-08-05 | 2 | 2.15 | 2.25 | 1.44 |
| 2019-08-06 | 2 | 2.15 | 2.25 | 1.44 |
| 2019-08-07 | 2 | 2.15 | 2.24 | 1.41 |
| 2019-08-08 | 2 | 2.14 | 2.24 | 1.32 |
| 2019-08-09 | 2 | 2.14 | 2.23 | 1.29 |
| 2019-08-12 | 2 | 2.14 | 2.23 | 1.33 |
| 2019-08-13 | 2 | 2.14 | 2.22 | 1.27 |
| 2019-08-14 | 2 | 2.14 | 2.21 | 1.23 |
| 2019-08-15 | 2 | 2.14 | 2.21 | 1.19 |
| 2019-08-16 | 2 | 2.14 | 2.2 | 1.21 |
| 2019-08-19 | 2 | 2.14 | 2.21 | 1.25 |
| 2019-08-20 | 2 | 2.14 | 2.21 | 1.25 |
| 2019-08-21 | 2 | 2.14 | 2.21 | 1.27 |
| 2019-08-22 | 2 | 2.14 | 2.2 | 1.3 |
| 2019-08-23 | 2 | 2.14 | 2.2 | 1.37 |
| 2019-08-26 | 2 | 2.14 | 2.2 | 1.32 |
| 2019-08-27 | 2 | 2.14 | 2.2 | 1.27 |
| 2019-08-28 | 2 | 2.14 | 2.2 | 1.2 |
| 2019-08-29 | 2 | 2.14 | 2.2 | 1.25 |
| 2019-08-30 | 2 | 2.14 | 2.2 | 1.3 |
| 2019-09-02 | 2 | 2.14 | 2.2 | 1.3 |
| 2019-09-03 | 2 | 2.14 | 2.2 | 1.28 |
| 2019-09-04 | 2 | 2.14 | 2.2 | 1.32 |
| 2019-09-05 | 2 | 2.14 | 2.2 | 1.39 |
| 2019-09-06 | 2 | 2.14 | 2.2 | 1.48 |
| 2019-09-09 | 2 | 2.14 | 2.2 | 1.51 |
| 2019-09-10 | 2 | 2.14 | 2.2 | 1.56 |
| 2019-09-11 | 2 | 2.14 | 2.2 | 1.62 |
| 2019-09-12 | 2 | 2.14 | 2.2 | 1.55 |
| 2019-09-13 | 2 | 2.14 | 2.2 | 1.63 |
| 2019-09-16 | 2 | 2.14 | 2.2 | 1.66 |
| 2019-09-17 | 2 | 2.14 | 2.2 | 1.67 |
| 2019-09-18 | 2 | 2.14 | 2.2 | 1.62 |
| 2019-09-19 | 2 | 2.14 | 2.2 | 1.6 |
| 2019-09-20 | 2 | 2.14 | 2.2 | 1.61 |
| 2019-09-23 | 2 | 2.14 | 2.2 | 1.58 |
| 2019-09-24 | 2 | 2.14 | 2.2 | 1.56 |
| 2019-09-25 | 2 | 2.14 | 2.2 | 1.53 |
| 2019-09-26 | 2 | 2.15 | 2.22 | 1.67 |
| 2019-09-27 | 2 | 2.16 | 2.23 | 1.65 |
| 2019-09-30 | 2 | 2.16 | 2.24 | 1.7 |
| 2019-10-01 | 2 | 2.16 | 2.25 | 1.78 |
| 2019-10-02 | 2 | 2.16 | 2.26 | 1.71 |
| 2019-10-03 | 2 | 2.17 | 2.26 | 1.59 |
| 2019-10-04 | 2 | 2.17 | 2.25 | 1.55 |
| 2019-10-07 | 2 | 2.17 | 2.26 | 1.57 |
| 2019-10-08 | 2 | 2.17 | 2.27 | 1.54 |
| 2019-10-09 | 2 | 2.17 | 2.27 | 1.55 |
| 2019-10-10 | 2 | 2.17 | 2.27 | 1.54 |
| 2019-10-11 | 2 | 2.17 | 2.27 | 1.64 |
| 2019-10-14 | 2 | 2.17 | 2.28 | 1.7 |
| 2019-10-15 | 2 | 2.17 | 2.28 | 1.72 |
| 2019-10-16 | 2 | 2.18 | 2.29 | 1.79 |
| 2019-10-17 | 2 | 2.18 | 2.29 | 1.84 |
| 2019-10-18 | 2 | 2.18 | 2.29 | 1.85 |
| 2019-10-21 | 2 | 2.18 | 2.29 | 1.78 |
| 2019-10-22 | 2 | 2.18 | 2.29 | 1.74 |
| 2019-10-23 | 2 | 2.18 | 2.29 | 1.76 |
| 2019-10-24 | 2 | 2.18 | 2.28 | 1.73 |
| 2019-10-25 | 2 | 2.18 | 2.28 | 1.74 |